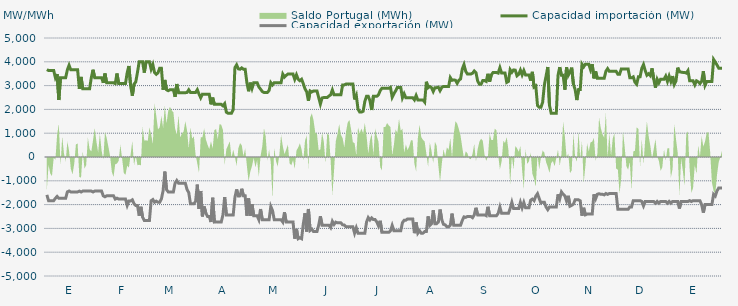
| Category | Capacidad importación (MW) | Capacidad exportación (MW) |
|---|---|---|
| 0 | 3670.833 | -1591.667 |
| 1900-01-01 | 3633.333 | -1833.333 |
| 1900-01-02 | 3633.333 | -1833.333 |
| 1900-01-03 | 3633.333 | -1833.333 |
| 1900-01-04 | 3633.333 | -1833.333 |
| 1900-01-05 | 3333.333 | -1733.333 |
| 1900-01-06 | 3483.333 | -1658.333 |
| 1900-01-07 | 2393.75 | -1733.333 |
| 1900-01-08 | 3333.333 | -1733.333 |
| 1900-01-09 | 3333.333 | -1733.333 |
| 1900-01-10 | 3333.333 | -1733.333 |
| 1900-01-11 | 3333.333 | -1733.333 |
| 1900-01-12 | 3662.5 | -1466.667 |
| 1900-01-13 | 3854.167 | -1429.167 |
| 1900-01-14 | 3662.5 | -1466.667 |
| 1900-01-15 | 3662.5 | -1466.667 |
| 1900-01-16 | 3662.5 | -1466.667 |
| 1900-01-17 | 3662.5 | -1466.667 |
| 1900-01-18 | 3662.5 | -1466.667 |
| 1900-01-19 | 2862.5 | -1433.333 |
| 1900-01-20 | 3364.583 | -1470.833 |
| 1900-01-21 | 2862.5 | -1433.333 |
| 1900-01-22 | 2862.5 | -1433.333 |
| 1900-01-23 | 2862.5 | -1433.333 |
| 1900-01-24 | 2862.5 | -1433.333 |
| 1900-01-25 | 2862.5 | -1433.333 |
| 1900-01-26 | 3333.333 | -1433.333 |
| 1900-01-27 | 3666.667 | -1470.833 |
| 1900-01-28 | 3333.333 | -1433.333 |
| 1900-01-29 | 3333.333 | -1433.333 |
| 1900-01-30 | 3333.333 | -1433.333 |
| 1900-01-31 | 3333.333 | -1433.333 |
| 1900-02-01 | 3333.333 | -1433.333 |
| 1900-02-02 | 3116.667 | -1633.333 |
| 1900-02-03 | 3508.333 | -1670.833 |
| 1900-02-04 | 3116.667 | -1633.333 |
| 1900-02-05 | 3116.667 | -1633.333 |
| 1900-02-06 | 3116.667 | -1633.333 |
| 1900-02-07 | 3116.667 | -1633.333 |
| 1900-02-08 | 3116.667 | -1633.333 |
| 1900-02-09 | 3087.5 | -1766.667 |
| 1900-02-10 | 3508.333 | -1729.167 |
| 1900-02-11 | 3087.5 | -1766.667 |
| 1900-02-12 | 3087.5 | -1766.667 |
| 1900-02-13 | 3087.5 | -1766.667 |
| 1900-02-14 | 3087.5 | -1766.667 |
| 1900-02-15 | 3087.5 | -1766.667 |
| 1900-02-16 | 3550 | -2033.333 |
| 1900-02-17 | 3825 | -1845.833 |
| 1900-02-18 | 2987.5 | -1845.833 |
| 1900-02-19 | 2575 | -1800 |
| 1900-02-20 | 3062.5 | -1962.5 |
| 1900-02-21 | 3154.167 | -2033.333 |
| 1900-02-22 | 3550 | -2033.333 |
| 1900-02-23 | 4000 | -2466.667 |
| 1900-02-24 | 4000 | -2091.667 |
| 1900-02-25 | 4000 | -2529.167 |
| 1900-02-26 | 3545.833 | -2666.667 |
| 1900-02-27 | 4000 | -2666.667 |
| 1900-02-28 | 4000 | -2666.667 |
| 1900-02-28 | 4000 | -2666.667 |
| 1900-03-01 | 3691.667 | -1837.5 |
| 1900-03-02 | 3883.333 | -1787.5 |
| 1900-03-03 | 3545.833 | -1900 |
| 1900-03-04 | 3475 | -1854.167 |
| 1900-03-05 | 3537.5 | -1900 |
| 1900-03-06 | 3733.333 | -1900 |
| 1900-03-07 | 3733.333 | -1762.5 |
| 1900-03-08 | 2825 | -1416.667 |
| 1900-03-09 | 3237.5 | -612.5 |
| 1900-03-10 | 2825 | -1370.833 |
| 1900-03-11 | 2787.5 | -1466.667 |
| 1900-03-12 | 2825 | -1466.667 |
| 1900-03-13 | 2825 | -1466.667 |
| 1900-03-14 | 2825 | -1466.667 |
| 1900-03-15 | 2529.167 | -1100 |
| 1900-03-16 | 3066.667 | -987.5 |
| 1900-03-17 | 2700 | -1100 |
| 1900-03-18 | 2700 | -1100 |
| 1900-03-19 | 2700 | -1100 |
| 1900-03-20 | 2700 | -1100 |
| 1900-03-21 | 2700 | -1100 |
| 1900-03-22 | 2712.5 | -1368.75 |
| 1900-03-23 | 2823.913 | -1495.652 |
| 1900-03-24 | 2712.5 | -1966.667 |
| 1900-03-25 | 2712.5 | -1966.667 |
| 1900-03-26 | 2712.5 | -1966.667 |
| 1900-03-27 | 2712.5 | -1862.5 |
| 1900-03-28 | 2827.083 | -1160.417 |
| 1900-03-29 | 2645.833 | -2179.167 |
| 1900-03-30 | 2487.5 | -1427.083 |
| 1900-03-31 | 2639.583 | -2495.833 |
| 1900-04-01 | 2633.333 | -2079.167 |
| 1900-04-02 | 2633.333 | -2350 |
| 1900-04-03 | 2633.333 | -2500 |
| 1900-04-04 | 2633.333 | -2500 |
| 1900-04-05 | 2212.5 | -2733.333 |
| 1900-04-06 | 2495.833 | -1712.5 |
| 1900-04-07 | 2212.5 | -2733.333 |
| 1900-04-08 | 2212.5 | -2725 |
| 1900-04-09 | 2212.5 | -2733.333 |
| 1900-04-10 | 2212.5 | -2733.333 |
| 1900-04-11 | 2212.5 | -2733.333 |
| 1900-04-12 | 2150 | -2433.333 |
| 1900-04-13 | 2241.667 | -1683.333 |
| 1900-04-14 | 1883.333 | -2433.333 |
| 1900-04-15 | 1837.5 | -2433.333 |
| 1900-04-16 | 1837.5 | -2433.333 |
| 1900-04-17 | 1837.5 | -2433.333 |
| 1900-04-18 | 1987.5 | -2433.333 |
| 1900-04-19 | 3754.167 | -1700 |
| 1900-04-20 | 3870.833 | -1362.5 |
| 1900-04-21 | 3704.167 | -1637.5 |
| 1900-04-22 | 3687.5 | -1633.333 |
| 1900-04-23 | 3743.75 | -1333.333 |
| 1900-04-24 | 3687.5 | -1633.333 |
| 1900-04-25 | 3687.5 | -1633.333 |
| 1900-04-26 | 3125 | -2466.667 |
| 1900-04-27 | 2762.5 | -1741.667 |
| 1900-04-28 | 3125 | -2466.667 |
| 1900-04-29 | 2881.25 | -1979.167 |
| 1900-04-30 | 3125 | -2466.667 |
| 1900-05-01 | 3125 | -2466.667 |
| 1900-05-02 | 3125 | -2466.667 |
| 1900-05-03 | 2941.667 | -2633.333 |
| 1900-05-04 | 2852.083 | -2187.5 |
| 1900-05-05 | 2752.083 | -2633.333 |
| 1900-05-06 | 2712.5 | -2633.333 |
| 1900-05-07 | 2712.5 | -2633.333 |
| 1900-05-08 | 2712.5 | -2633.333 |
| 1900-05-09 | 2795.833 | -2633.333 |
| 1900-05-10 | 3125 | -2079.583 |
| 1900-05-11 | 3029.167 | -2250 |
| 1900-05-12 | 3125 | -2633.333 |
| 1900-05-13 | 3125 | -2633.333 |
| 1900-05-14 | 3125 | -2633.333 |
| 1900-05-15 | 3125 | -2633.333 |
| 1900-05-16 | 3125 | -2633.333 |
| 1900-05-17 | 3483.333 | -2733.333 |
| 1900-05-18 | 3358.333 | -2320.833 |
| 1900-05-19 | 3429.167 | -2733.333 |
| 1900-05-20 | 3483.333 | -2733.333 |
| 1900-05-21 | 3483.333 | -2733.333 |
| 1900-05-22 | 3483.333 | -2733.333 |
| 1900-05-23 | 3483.333 | -2733.333 |
| 1900-05-24 | 3266.667 | -3433.333 |
| 1900-05-25 | 3454.167 | -3020.833 |
| 1900-05-26 | 3266.667 | -3433.333 |
| 1900-05-27 | 3204.167 | -3391.667 |
| 1900-05-28 | 3266.667 | -3433.333 |
| 1900-05-29 | 3083.333 | -2816.667 |
| 1900-05-30 | 2866.667 | -2362.5 |
| 1900-05-31 | 2737.5 | -3133.333 |
| 1900-06-01 | 2358.333 | -2183.333 |
| 1900-06-02 | 2775 | -3085.417 |
| 1900-06-03 | 2733.333 | -3029.167 |
| 1900-06-04 | 2775 | -3133.333 |
| 1900-06-05 | 2775 | -3133.333 |
| 1900-06-06 | 2775 | -3133.333 |
| 1900-06-07 | 2500 | -2866.667 |
| 1900-06-08 | 2225 | -2491.667 |
| 1900-06-09 | 2481.25 | -2866.667 |
| 1900-06-10 | 2500 | -2866.667 |
| 1900-06-11 | 2500 | -2866.667 |
| 1900-06-12 | 2500 | -2866.667 |
| 1900-06-13 | 2562.5 | -2866.667 |
| 1900-06-14 | 2612.5 | -2966.667 |
| 1900-06-15 | 2818.75 | -2704.167 |
| 1900-06-16 | 2612.5 | -2833.333 |
| 1900-06-17 | 2612.5 | -2737.5 |
| 1900-06-18 | 2612.5 | -2766.667 |
| 1900-06-19 | 2612.5 | -2766.667 |
| 1900-06-20 | 2612.5 | -2766.667 |
| 1900-06-21 | 3025 | -2850 |
| 1900-06-22 | 3029.167 | -2858.333 |
| 1900-06-23 | 3066.667 | -2933.333 |
| 1900-06-24 | 3066.667 | -2933.333 |
| 1900-06-25 | 3066.667 | -2933.333 |
| 1900-06-26 | 3066.667 | -2933.333 |
| 1900-06-27 | 3066.667 | -2933.333 |
| 1900-06-28 | 2416.667 | -3200 |
| 1900-06-29 | 2585.417 | -2975 |
| 1900-06-30 | 2012.5 | -3200 |
| 1900-07-01 | 1887.5 | -3200 |
| 1900-07-02 | 1887.5 | -3200 |
| 1900-07-03 | 1920.833 | -3200 |
| 1900-07-04 | 2333.333 | -3200 |
| 1900-07-05 | 2550 | -2733.333 |
| 1900-07-06 | 2550 | -2545.833 |
| 1900-07-07 | 2362.5 | -2645.833 |
| 1900-07-08 | 1975 | -2558.333 |
| 1900-07-09 | 2550 | -2629.167 |
| 1900-07-10 | 2550 | -2629.167 |
| 1900-07-11 | 2550 | -2729.167 |
| 1900-07-12 | 2616.667 | -2895.833 |
| 1900-07-13 | 2793.75 | -2679.167 |
| 1900-07-14 | 2887.5 | -3166.667 |
| 1900-07-15 | 2887.5 | -3166.667 |
| 1900-07-16 | 2887.5 | -3166.667 |
| 1900-07-17 | 2887.5 | -3166.667 |
| 1900-07-18 | 2887.5 | -3166.667 |
| 1900-07-19 | 2925 | -3100 |
| 1900-07-20 | 2512.5 | -2875 |
| 1900-07-21 | 2658.333 | -3100 |
| 1900-07-22 | 2779.167 | -3100 |
| 1900-07-23 | 2925 | -3100 |
| 1900-07-24 | 2925 | -3100 |
| 1900-07-25 | 2925 | -3100 |
| 1900-07-26 | 2487.5 | -2758.333 |
| 1900-07-27 | 2656.25 | -2658.333 |
| 1900-07-28 | 2487.5 | -2654.167 |
| 1900-07-29 | 2487.5 | -2600 |
| 1900-07-30 | 2487.5 | -2600 |
| 1900-07-31 | 2487.5 | -2600 |
| 1900-08-01 | 2487.5 | -2600 |
| 1900-08-02 | 2400 | -3200 |
| 1900-08-03 | 2583.333 | -2750 |
| 1900-08-04 | 2400 | -3200 |
| 1900-08-05 | 2400 | -3100 |
| 1900-08-06 | 2400 | -3200 |
| 1900-08-07 | 2400 | -3200 |
| 1900-08-08 | 2308.333 | -3133.333 |
| 1900-08-09 | 3162.5 | -3133.333 |
| 1900-08-10 | 2910.417 | -2495.833 |
| 1900-08-11 | 2962.5 | -2875 |
| 1900-08-12 | 2912.5 | -2800 |
| 1900-08-13 | 2752.083 | -2237.5 |
| 1900-08-14 | 2912.5 | -2800 |
| 1900-08-15 | 2912.5 | -2800 |
| 1900-08-16 | 2933.333 | -2733.333 |
| 1900-08-17 | 2787.5 | -2208.333 |
| 1900-08-18 | 2929.167 | -2633.333 |
| 1900-08-19 | 2962.5 | -2829.167 |
| 1900-08-20 | 2962.5 | -2850 |
| 1900-08-21 | 2962.5 | -2933.333 |
| 1900-08-22 | 2962.5 | -2933.333 |
| 1900-08-23 | 3337.5 | -2866.667 |
| 1900-08-24 | 3222.917 | -2379.167 |
| 1900-08-25 | 3237.5 | -2866.667 |
| 1900-08-26 | 3225 | -2866.667 |
| 1900-08-27 | 3095.833 | -2866.667 |
| 1900-08-28 | 3225 | -2866.667 |
| 1900-08-29 | 3281.25 | -2866.667 |
| 1900-08-30 | 3700 | -2666.667 |
| 1900-08-31 | 3883.333 | -2516.667 |
| 1900-09-01 | 3600 | -2537.5 |
| 1900-09-02 | 3487.5 | -2500 |
| 1900-09-03 | 3487.5 | -2500 |
| 1900-09-04 | 3487.5 | -2500 |
| 1900-09-05 | 3518.75 | -2550 |
| 1900-09-06 | 3612.5 | -2433.333 |
| 1900-09-07 | 3543.75 | -2133.333 |
| 1900-09-08 | 3193.75 | -2433.333 |
| 1900-09-09 | 3060.417 | -2433.333 |
| 1900-09-10 | 3059.167 | -2433.333 |
| 1900-09-11 | 3212.5 | -2433.333 |
| 1900-09-12 | 3212.5 | -2433.333 |
| 1900-09-13 | 3175 | -2466.667 |
| 1900-09-14 | 3495.833 | -2091.667 |
| 1900-09-15 | 3166.667 | -2466.667 |
| 1900-09-16 | 3454.167 | -2466.667 |
| 1900-09-17 | 3550 | -2466.667 |
| 1900-09-18 | 3550 | -2466.667 |
| 1900-09-19 | 3550 | -2466.667 |
| 1900-09-20 | 3525 | -2366.667 |
| 1900-09-21 | 3754.167 | -2104.167 |
| 1900-09-22 | 3525 | -2366.667 |
| 1900-09-23 | 3525 | -2366.667 |
| 1900-09-24 | 3525 | -2366.667 |
| 1900-09-25 | 3135 | -2366.667 |
| 1900-09-26 | 3175 | -2366.667 |
| 1900-09-27 | 3666.667 | -2166.667 |
| 1900-09-28 | 3558.333 | -1904.167 |
| 1900-09-29 | 3658.333 | -2166.667 |
| 1900-09-30 | 3650 | -2166.667 |
| 1900-10-01 | 3412.5 | -2166.667 |
| 1900-10-02 | 3475 | -2166.667 |
| 1900-10-03 | 3650 | -1904.167 |
| 1900-10-04 | 3450 | -2133.333 |
| 1900-10-05 | 3633.333 | -1912.5 |
| 1900-10-06 | 3450 | -2133.333 |
| 1900-10-07 | 3450 | -2133.333 |
| 1900-10-08 | 3450 | -2133.333 |
| 1900-10-09 | 3210.417 | -1816.667 |
| 1900-10-10 | 3577.083 | -1766.667 |
| 1900-10-11 | 2937.5 | -1833.333 |
| 1900-10-12 | 2985.417 | -1645.833 |
| 1900-10-13 | 2162.5 | -1541.667 |
| 1900-10-14 | 2087.5 | -1745.833 |
| 1900-10-15 | 2087.5 | -1929.167 |
| 1900-10-16 | 2295.833 | -1900 |
| 1900-10-17 | 3025 | -1900 |
| 1900-10-18 | 3395.833 | -2100 |
| 1900-10-19 | 3781.25 | -2212.5 |
| 1900-10-20 | 2170.833 | -2100 |
| 1900-10-21 | 1837.5 | -2100 |
| 1900-10-22 | 1837.5 | -2100 |
| 1900-10-23 | 1837.5 | -2100 |
| 1900-10-24 | 1837.5 | -2100 |
| 1900-10-25 | 3433.333 | -1566.667 |
| 1900-10-26 | 3776 | -1760 |
| 1900-10-27 | 3433.333 | -1466.667 |
| 1900-10-28 | 3433.333 | -1566.667 |
| 1900-10-29 | 2829.167 | -1633.333 |
| 1900-10-30 | 3766.667 | -1854.167 |
| 1900-10-31 | 3433.333 | -1629.167 |
| 1900-11-01 | 3562.5 | -2066.667 |
| 1900-11-02 | 3754.167 | -2029.167 |
| 1900-11-03 | 3064.583 | -1979.167 |
| 1900-11-04 | 2833.333 | -1800 |
| 1900-11-05 | 2391.667 | -1800 |
| 1900-11-06 | 2833.333 | -1800 |
| 1900-11-07 | 2833.333 | -1841.667 |
| 1900-11-08 | 3900 | -2466.667 |
| 1900-11-09 | 3787.5 | -2133.333 |
| 1900-11-10 | 3900 | -2429.167 |
| 1900-11-11 | 3900 | -2400 |
| 1900-11-12 | 3900 | -2400 |
| 1900-11-13 | 3668.75 | -2400 |
| 1900-11-14 | 3900 | -2400 |
| 1900-11-15 | 3304.167 | -1566.667 |
| 1900-11-16 | 3595.833 | -1754.167 |
| 1900-11-17 | 3304.167 | -1566.667 |
| 1900-11-18 | 3304.167 | -1541.667 |
| 1900-11-19 | 3304.167 | -1566.667 |
| 1900-11-20 | 3304.167 | -1566.667 |
| 1900-11-21 | 3304.167 | -1591.667 |
| 1900-11-22 | 3600 | -1533.333 |
| 1900-11-23 | 3712.5 | -1570.833 |
| 1900-11-24 | 3600 | -1533.333 |
| 1900-11-25 | 3600 | -1533.333 |
| 1900-11-26 | 3600 | -1533.333 |
| 1900-11-27 | 3600 | -1533.333 |
| 1900-11-28 | 3600 | -1533.333 |
| 1900-11-29 | 3475 | -2200 |
| 1900-11-30 | 3475 | -2200 |
| 1900-12-01 | 3700 | -2200 |
| 1900-12-02 | 3700 | -2200 |
| 1900-12-03 | 3700 | -2200 |
| 1900-12-04 | 3700 | -2200 |
| 1900-12-05 | 3700 | -2200 |
| 1900-12-06 | 3329.167 | -2095.833 |
| 1900-12-07 | 3329.167 | -2095.833 |
| 1900-12-08 | 3366.667 | -1833.333 |
| 1900-12-09 | 3141.667 | -1833.333 |
| 1900-12-10 | 3058.333 | -1833.333 |
| 1900-12-11 | 3366.667 | -1833.333 |
| 1900-12-12 | 3366.667 | -1833.333 |
| 1900-12-13 | 3725 | -1866.667 |
| 1900-12-14 | 3883.333 | -2054.167 |
| 1900-12-15 | 3631.25 | -1866.667 |
| 1900-12-16 | 3435.417 | -1866.667 |
| 1900-12-17 | 3495.833 | -1866.667 |
| 1900-12-18 | 3416.667 | -1866.667 |
| 1900-12-19 | 3725 | -1866.667 |
| 1900-12-20 | 3266.667 | -1866.667 |
| 1900-12-21 | 2912.5 | -1941.667 |
| 1900-12-22 | 3266.667 | -1866.667 |
| 1900-12-23 | 3116.667 | -1941.667 |
| 1900-12-24 | 3266.667 | -1866.667 |
| 1900-12-25 | 3266.667 | -1866.667 |
| 1900-12-26 | 3266.667 | -1866.667 |
| 1900-12-27 | 3400 | -1866.667 |
| 1900-12-28 | 3175 | -1941.667 |
| 1900-12-29 | 3400 | -1866.667 |
| 1900-12-30 | 3175 | -1941.667 |
| 1900-12-31 | 3400 | -1866.667 |
| 1901-01-01 | 3047.917 | -1866.667 |
| 1901-01-02 | 3200 | -1866.667 |
| 1901-01-03 | 3754.167 | -1866.667 |
| 1901-01-04 | 3581.25 | -2166.667 |
| 1901-01-05 | 3566.667 | -1866.667 |
| 1901-01-06 | 3554.167 | -1866.667 |
| 1901-01-07 | 3554.167 | -1866.667 |
| 1901-01-08 | 3525 | -1866.667 |
| 1901-01-09 | 3629.167 | -1866.667 |
| 1901-01-10 | 3200 | -1833.333 |
| 1901-01-11 | 3200 | -1870.833 |
| 1901-01-12 | 3200 | -1833.333 |
| 1901-01-13 | 3031.25 | -1833.333 |
| 1901-01-14 | 3200 | -1833.333 |
| 1901-01-15 | 3162.5 | -1833.333 |
| 1901-01-16 | 3083.333 | -1833.333 |
| 1901-01-17 | 3175 | -2000 |
| 1901-01-18 | 3608.333 | -2337.5 |
| 1901-01-19 | 3016.667 | -2000 |
| 1901-01-20 | 3175 | -2000 |
| 1901-01-21 | 3175 | -2000 |
| 1901-01-22 | 3175 | -2000 |
| 1901-01-23 | 3175 | -2000 |
| 1901-01-24 | 4100 | -1566.667 |
| 1901-01-25 | 3987.5 | -1641.667 |
| 1901-01-26 | 3864.583 | -1425 |
| 1901-01-27 | 3733.333 | -1300 |
| 1901-01-28 | 3733.333 | -1300 |
| 1901-01-29 | 3733.333 | -1300 |